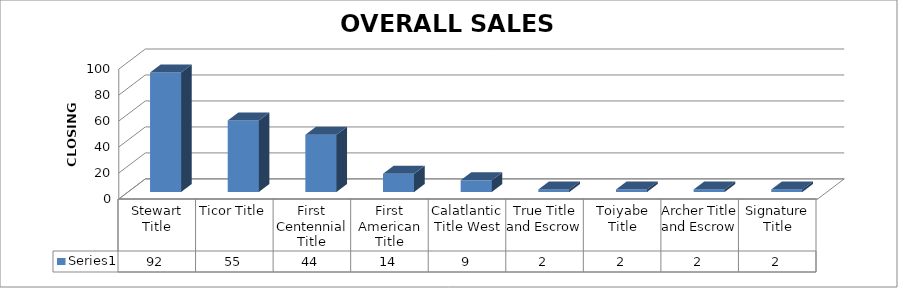
| Category | Series 0 |
|---|---|
| Stewart Title | 92 |
| Ticor Title | 55 |
| First Centennial Title | 44 |
| First American Title | 14 |
| Calatlantic Title West | 9 |
| True Title and Escrow | 2 |
| Toiyabe Title | 2 |
| Archer Title and Escrow | 2 |
| Signature Title | 2 |